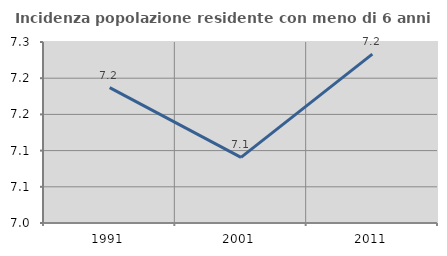
| Category | Incidenza popolazione residente con meno di 6 anni |
|---|---|
| 1991.0 | 7.187 |
| 2001.0 | 7.091 |
| 2011.0 | 7.233 |